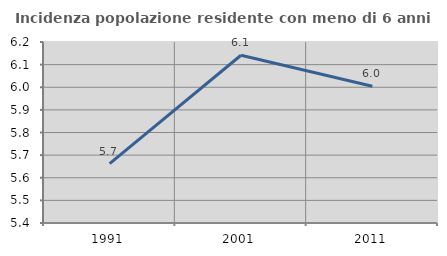
| Category | Incidenza popolazione residente con meno di 6 anni |
|---|---|
| 1991.0 | 5.662 |
| 2001.0 | 6.141 |
| 2011.0 | 6.005 |